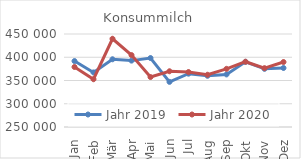
| Category | Jahr 2019 | Jahr 2020 |
|---|---|---|
| Jan | 391803.61 | 379089.765 |
| Feb | 367355.745 | 352735.906 |
| Mär | 395632.529 | 439756.588 |
| Apr | 392770.41 | 404663.67 |
| Mai | 398324.01 | 357438.549 |
| Jun | 347044.952 | 369888.561 |
| Jul | 364679.555 | 368199.853 |
| Aug | 360122.493 | 362367.346 |
| Sep | 363094.844 | 375083.306 |
| Okt | 390142.133 | 390417.104 |
| Nov | 375118.037 | 376486.127 |
| Dez | 376887.332 | 389737.188 |